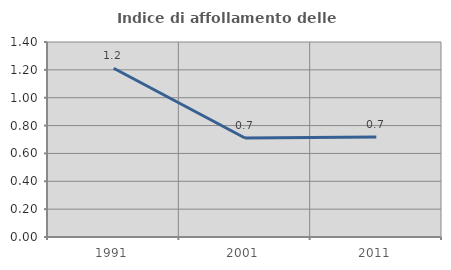
| Category | Indice di affollamento delle abitazioni  |
|---|---|
| 1991.0 | 1.212 |
| 2001.0 | 0.711 |
| 2011.0 | 0.717 |